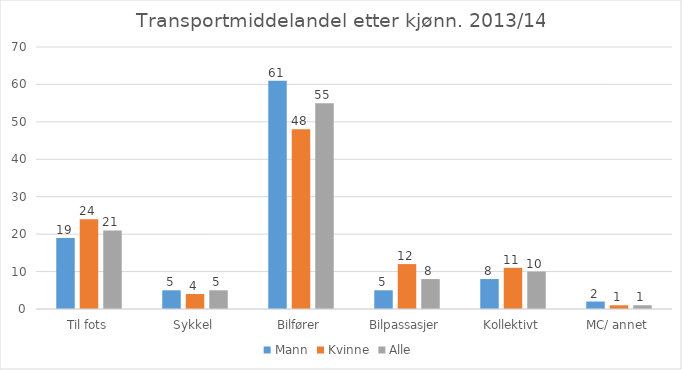
| Category | Mann | Kvinne | Alle |
|---|---|---|---|
| Til fots | 19 | 24 | 21 |
| Sykkel | 5 | 4 | 5 |
| Bilfører | 61 | 48 | 55 |
| Bilpassasjer | 5 | 12 | 8 |
| Kollektivt | 8 | 11 | 10 |
| MC/ annet | 2 | 1 | 1 |